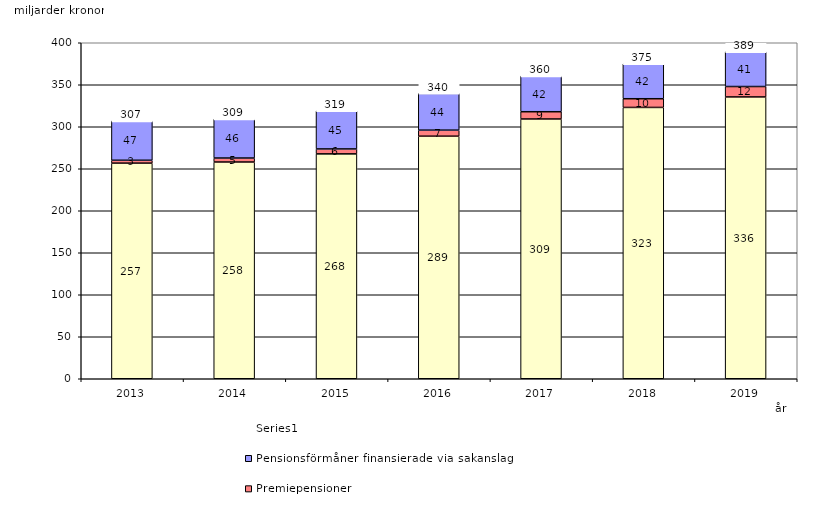
| Category | Inkomstpension och tilläggspension m.m. | Premiepensioner | Pensionsförmåner finansierade via sakanslag | Series 0 |
|---|---|---|---|---|
| 2013.0 | 256.702 | 3.406 | 46.818 | 20 |
| 2014.0 | 258.021 | 4.746 | 46.35 | 20 |
| 2015.0 | 267.725 | 5.877 | 45.308 | 20 |
| 2016.0 | 288.779 | 7.167 | 43.788 | 20 |
| 2017.0 | 309.256 | 8.635 | 42.453 | 20 |
| 2018.0 | 322.999 | 10.37 | 41.645 | 20 |
| 2019.0 | 335.508 | 12.385 | 41.475 | 20 |